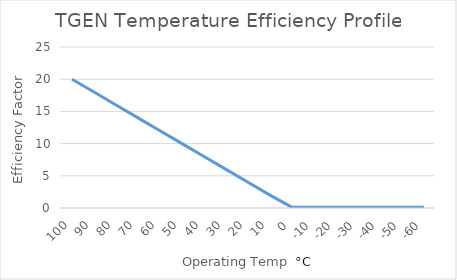
| Category | Series 0 |
|---|---|
| 100.0 | 20 |
| 90.0 | 18 |
| 80.0 | 16 |
| 70.0 | 14 |
| 60.0 | 12 |
| 50.0 | 10 |
| 40.0 | 8 |
| 30.0 | 6 |
| 20.0 | 4 |
| 10.0 | 2 |
| 0.0 | 0.1 |
| -10.0 | 0.1 |
| -20.0 | 0.1 |
| -30.0 | 0.1 |
| -40.0 | 0.1 |
| -50.0 | 0.1 |
| -60.0 | 0.1 |